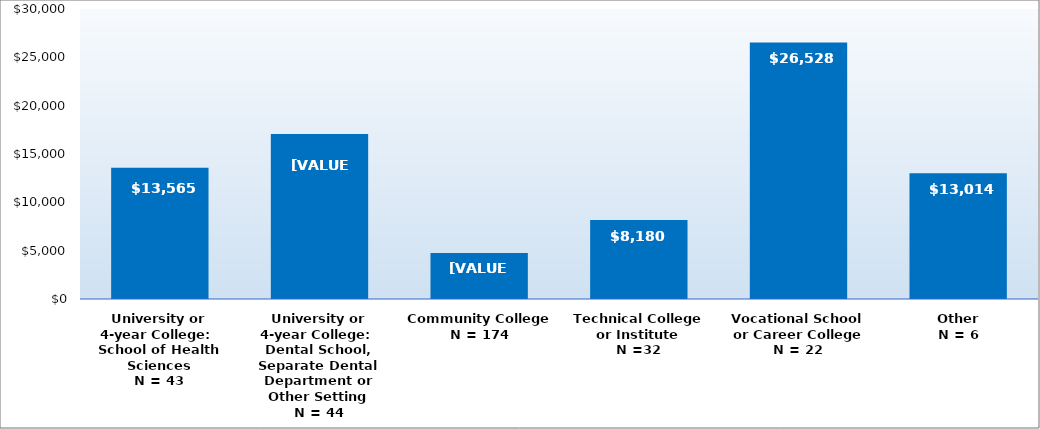
| Category | Series 0 |
|---|---|
| University or 4-year College: 
School of Health Sciences
N = 43 | 13565 |
| University or 4-year College: 
Dental School, Separate Dental Department or Other Setting
N = 44 | 17068 |
| Community College
N = 174 | 4756 |
| Technical College or Institute
N =32 | 8180 |
| Vocational School or Career College
N = 22 | 26528 |
| Other
N = 6 | 13014 |